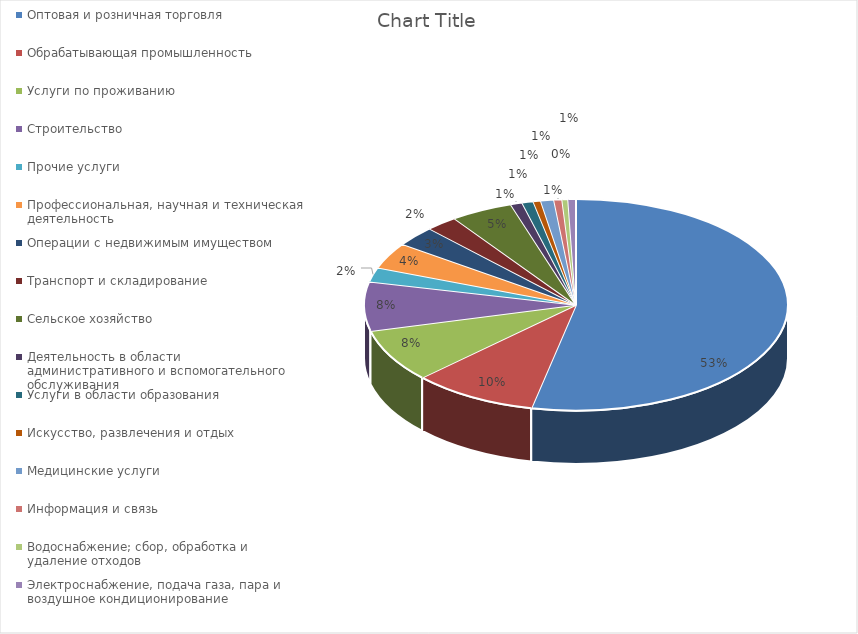
| Category | Series 0 |
|---|---|
| Оптовая и розничная торговля | 0.534 |
| Обрабатывающая промышленность | 0.095 |
| Услуги по проживанию | 0.081 |
| Строительство | 0.075 |
| Прочие услуги | 0.022 |
| Профессиональная, научная и техническая деятельность | 0.04 |
| Операции с недвижимым имуществом | 0.031 |
| Транспорт и складирование | 0.024 |
| Сельское хозяйство | 0.048 |
| Деятельность в области административного и вспомогательного обслуживания | 0.009 |
| Услуги в области образования | 0.009 |
| Искусство, развлечения и отдых | 0.006 |
| Медицинские услуги | 0.01 |
| Информация и связь | 0.006 |
| Водоснабжение; сбор, обработка и удаление отходов | 0.005 |
| Электроснабжение, подача газа, пара и воздушное кондиционирование | 0.006 |